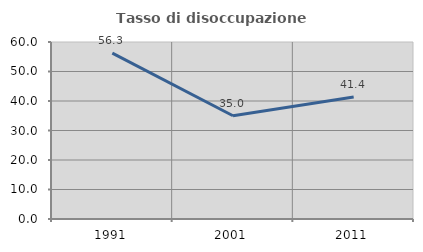
| Category | Tasso di disoccupazione giovanile  |
|---|---|
| 1991.0 | 56.25 |
| 2001.0 | 35 |
| 2011.0 | 41.379 |